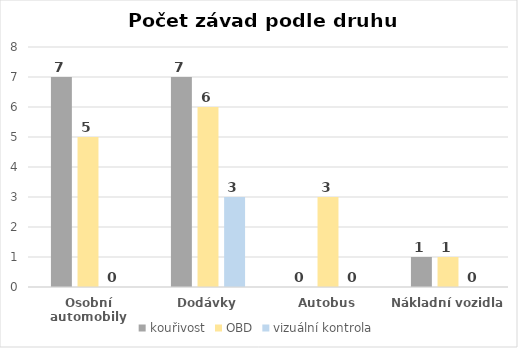
| Category | kouřivost | OBD | vizuální kontrola |
|---|---|---|---|
| Osobní automobily | 7 | 5 | 0 |
| Dodávky | 7 | 6 | 3 |
| Autobus | 0 | 3 | 0 |
| Nákladní vozidla | 1 | 1 | 0 |